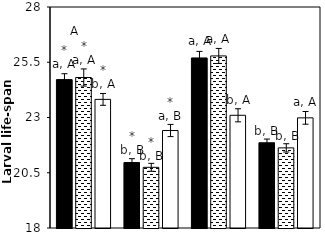
| Category | AB | AC | CK |
|---|---|---|---|
| aCO2-Bt | 24.714 | 24.81 | 23.82 |
| aCO2-Xy | 20.961 | 20.746 | 22.411 |
| eCO2-Bt | 25.694 | 25.786 | 23.1 |
| eCO2-Xy | 21.857 | 21.625 | 22.984 |